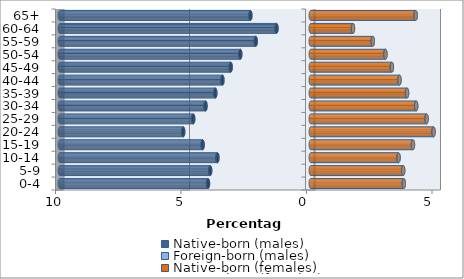
| Category | Native-born (males) | Foreign-born (males) | Native-born (females) | Foreign-born (females) |
|---|---|---|---|---|
| 0-4 | -4.094 | -0.001 | 3.704 | 0.001 |
| 5-9 | -4.007 | -0.002 | 3.681 | 0.002 |
| 10-14 | -3.718 | -0.002 | 3.497 | 0.002 |
| 15-19 | -4.309 | -0.002 | 4.07 | 0.002 |
| 20-24 | -5.082 | -0.004 | 4.89 | 0.003 |
| 25-29 | -4.683 | -0.005 | 4.611 | 0.003 |
| 30-34 | -4.194 | -0.006 | 4.198 | 0.004 |
| 35-39 | -3.803 | -0.006 | 3.835 | 0.004 |
| 40-44 | -3.52 | -0.005 | 3.532 | 0.003 |
| 45-49 | -3.192 | -0.004 | 3.231 | 0.002 |
| 50-54 | -2.809 | -0.003 | 2.974 | 0.001 |
| 55-59 | -2.193 | -0.002 | 2.47 | 0.001 |
| 60-64 | -1.365 | -0.001 | 1.681 | 0.001 |
| 65+ | -2.404 | -0.001 | 4.178 | 0.002 |